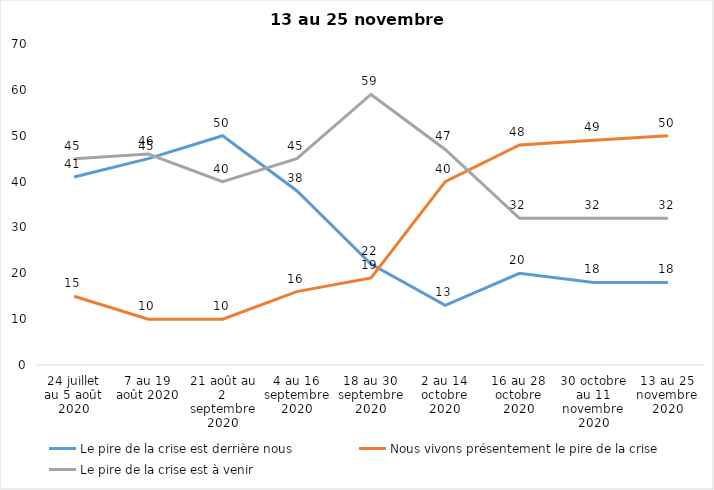
| Category | Le pire de la crise est derrière nous | Nous vivons présentement le pire de la crise | Le pire de la crise est à venir |
|---|---|---|---|
| 24 juillet au 5 août 2020 | 41 | 15 | 45 |
| 7 au 19 août 2020 | 45 | 10 | 46 |
| 21 août au 2 septembre 2020 | 50 | 10 | 40 |
| 4 au 16 septembre 2020 | 38 | 16 | 45 |
| 18 au 30 septembre 2020 | 22 | 19 | 59 |
| 2 au 14 octobre 2020 | 13 | 40 | 47 |
| 16 au 28 octobre 2020 | 20 | 48 | 32 |
| 30 octobre au 11 novembre 2020 | 18 | 49 | 32 |
| 13 au 25 novembre 2020 | 18 | 50 | 32 |